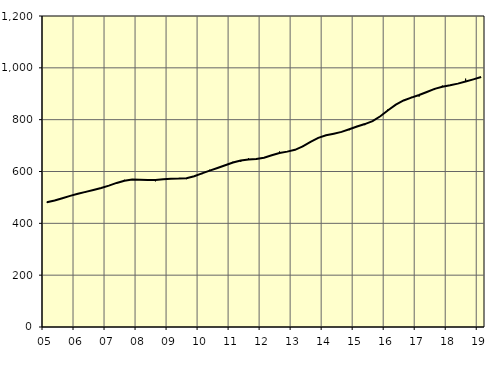
| Category | Trend | Säsongrensat |
|---|---|---|
| 5.0 | 481.02 | 482.3 |
| nan | 488.38 | 487.9 |
| 6.0 | 497.07 | 494.1 |
| 6.0 | 505.98 | 506.6 |
| 6.0 | 514.12 | 512.9 |
| nan | 521.44 | 519.4 |
| 7.0 | 528.73 | 528.3 |
| 7.0 | 536.4 | 536.4 |
| 7.0 | 545.5 | 546.3 |
| nan | 555.9 | 557.2 |
| 8.0 | 564.57 | 568.1 |
| 8.0 | 568.71 | 567.3 |
| 8.0 | 568.41 | 568.6 |
| nan | 566.86 | 566.2 |
| 9.0 | 567.17 | 561.9 |
| 9.0 | 569.75 | 569.4 |
| 9.0 | 571.99 | 571.8 |
| nan | 572.52 | 574.4 |
| 10.0 | 574.38 | 570.5 |
| 10.0 | 581.5 | 581.6 |
| 10.0 | 592.64 | 589.6 |
| nan | 603.55 | 606.9 |
| 11.0 | 613.73 | 611.6 |
| 11.0 | 624.18 | 623 |
| 11.0 | 634.43 | 637.6 |
| nan | 642.3 | 637.1 |
| 12.0 | 645.91 | 651.2 |
| 12.0 | 648.31 | 646.3 |
| 12.0 | 653.44 | 654 |
| nan | 662.44 | 663.1 |
| 13.0 | 671.3 | 677.3 |
| 13.0 | 676.7 | 676.4 |
| 13.0 | 683.57 | 682.6 |
| nan | 696.72 | 699.1 |
| 14.0 | 714.1 | 711.3 |
| 14.0 | 729.59 | 731.1 |
| 14.0 | 739.83 | 737.9 |
| nan | 746.04 | 744.7 |
| 15.0 | 752.81 | 751.9 |
| 15.0 | 762.82 | 759.4 |
| 15.0 | 773.39 | 775.9 |
| nan | 783.03 | 778.8 |
| 16.0 | 794.56 | 792 |
| 16.0 | 813.26 | 811.6 |
| 16.0 | 836.6 | 840.9 |
| nan | 858.11 | 860 |
| 17.0 | 874.06 | 873.3 |
| 17.0 | 885.13 | 888.1 |
| 17.0 | 894.98 | 888.8 |
| nan | 906.64 | 907.6 |
| 18.0 | 918.88 | 914.3 |
| 18.0 | 927.31 | 931.6 |
| 18.0 | 932.69 | 932.3 |
| nan | 939.09 | 938.2 |
| 19.0 | 947.01 | 958.4 |
| 19.0 | 955.45 | 954.2 |
| 19.0 | 964.32 | 964.6 |